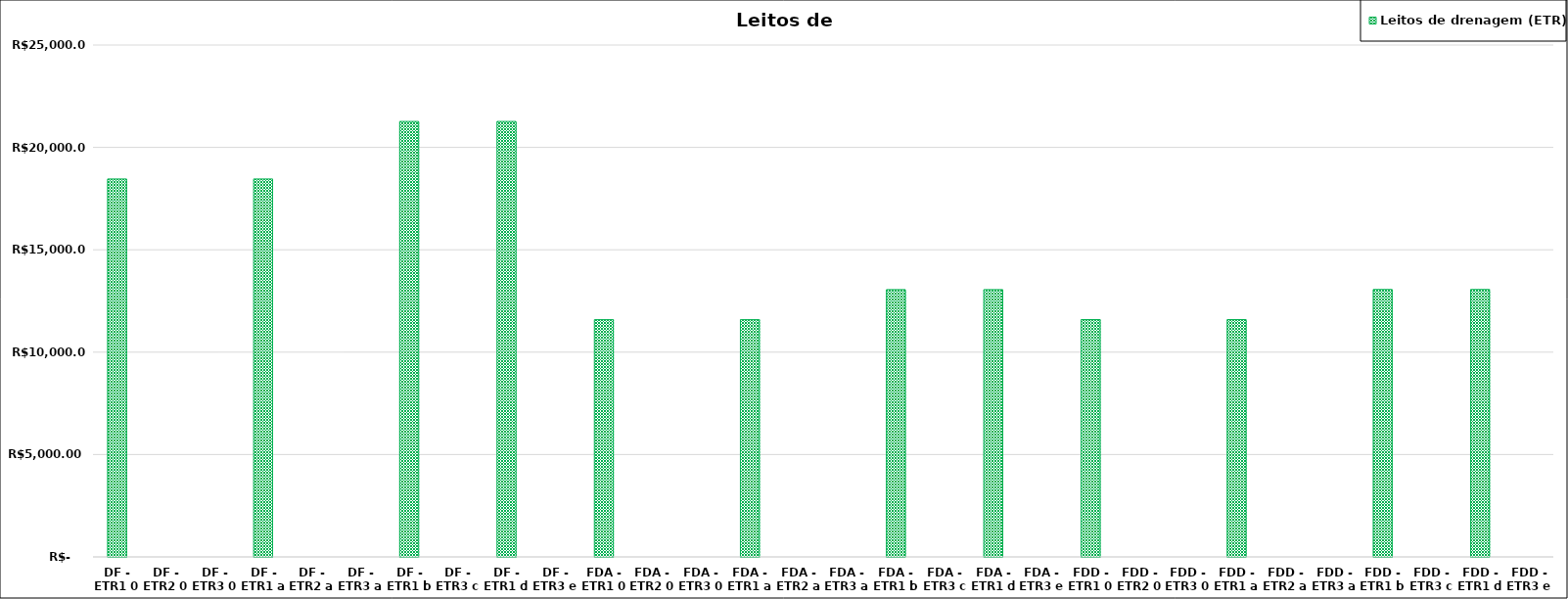
| Category | Leitos de drenagem (ETR) |
|---|---|
| DF - ETR1 0 | 18456.831 |
| DF - ETR2 0 | 0 |
| DF - ETR3 0 | 0 |
| DF - ETR1 a | 18456.831 |
| DF - ETR2 a | 0 |
| DF - ETR3 a | 0 |
| DF - ETR1 b | 21267.695 |
| DF - ETR3 c | 0 |
| DF - ETR1 d | 21267.695 |
| DF - ETR3 e | 0 |
| FDA - ETR1 0 | 11586.842 |
| FDA - ETR2 0 | 0 |
| FDA - ETR3 0 | 0 |
| FDA - ETR1 a | 11586.842 |
| FDA - ETR2 a | 0 |
| FDA - ETR3 a | 0 |
| FDA - ETR1 b | 13053.852 |
| FDA - ETR3 c | 0 |
| FDA - ETR1 d | 13053.852 |
| FDA - ETR3 e | 0 |
| FDD - ETR1 0 | 11590.437 |
| FDD - ETR2 0 | 0 |
| FDD - ETR3 0 | 0 |
| FDD - ETR1 a | 11590.437 |
| FDD - ETR2 a | 0 |
| FDD - ETR3 a | 0 |
| FDD - ETR1 b | 13060.425 |
| FDD - ETR3 c | 0 |
| FDD - ETR1 d | 13060.425 |
| FDD - ETR3 e | 0 |